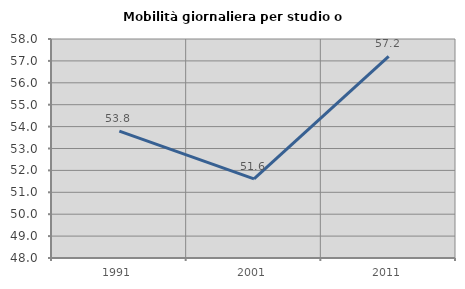
| Category | Mobilità giornaliera per studio o lavoro |
|---|---|
| 1991.0 | 53.791 |
| 2001.0 | 51.613 |
| 2011.0 | 57.207 |